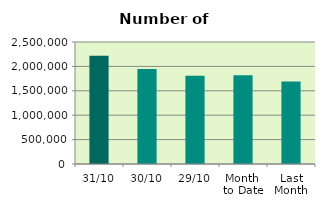
| Category | Series 0 |
|---|---|
| 31/10 | 2218214 |
| 30/10 | 1945920 |
| 29/10 | 1809892 |
| Month 
to Date | 1817802.609 |
| Last
Month | 1689477.048 |